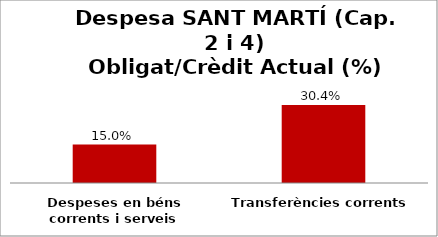
| Category | Series 0 |
|---|---|
| Despeses en béns corrents i serveis | 0.15 |
| Transferències corrents | 0.304 |